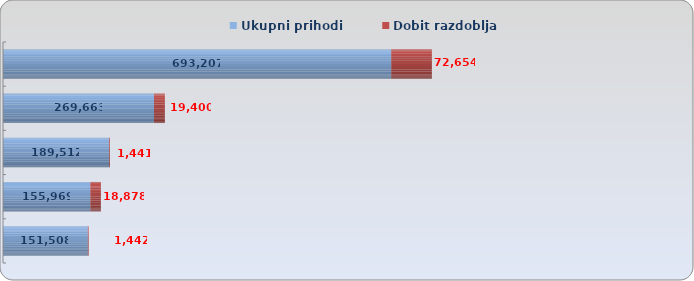
| Category | Ukupni prihodi | Dobit razdoblja |
|---|---|---|
| BOBIS d.o.o. | 151508.219 | 1442.407 |
| PEKARA DUBRAVICAd.o.o. | 155969.351 | 18877.58 |
| ZAGREBAČKE PEKARNE KLARA d.d. | 189512.351 | 1441.396 |
| PAN-PEK d.o.o. | 269662.601 | 19400.43 |
| MLINAR d.d. | 693207.496 | 72654.046 |